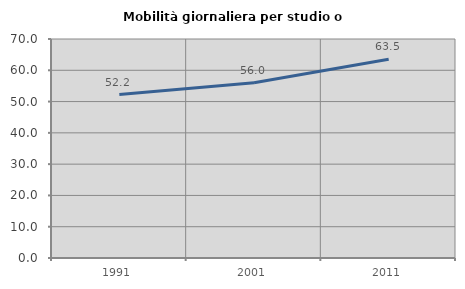
| Category | Mobilità giornaliera per studio o lavoro |
|---|---|
| 1991.0 | 52.244 |
| 2001.0 | 56.038 |
| 2011.0 | 63.534 |